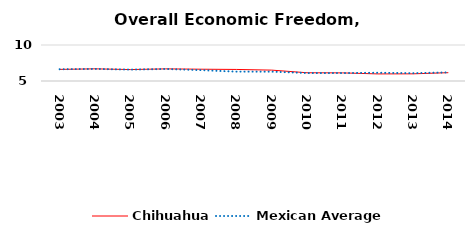
| Category | Chihuahua | Mexican Average  |
|---|---|---|
| 2003.0 | 6.612 | 6.632 |
| 2004.0 | 6.689 | 6.678 |
| 2005.0 | 6.588 | 6.582 |
| 2006.0 | 6.684 | 6.668 |
| 2007.0 | 6.638 | 6.508 |
| 2008.0 | 6.605 | 6.3 |
| 2009.0 | 6.512 | 6.3 |
| 2010.0 | 6.144 | 6.105 |
| 2011.0 | 6.127 | 6.103 |
| 2012.0 | 5.983 | 6.144 |
| 2013.0 | 5.995 | 6.087 |
| 2014.0 | 6.155 | 6.195 |